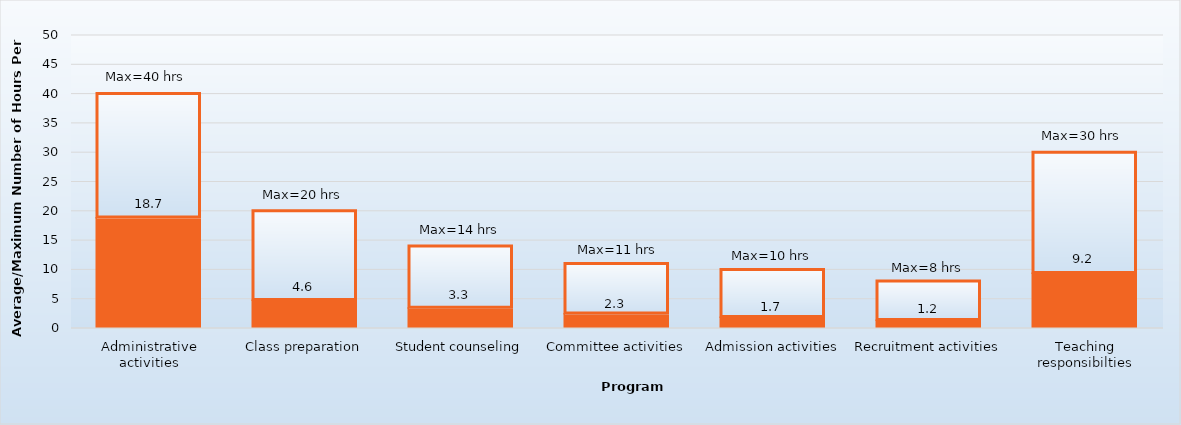
| Category | Average hours per week | Maximum |
|---|---|---|
| Administrative activities | 18.7 | 21.3 |
| Class preparation | 4.6 | 15.4 |
| Student counseling | 3.3 | 10.7 |
| Committee activities | 2.3 | 8.7 |
| Admission activities | 1.7 | 8.3 |
| Recruitment activities | 1.2 | 6.8 |
| Teaching responsibilties | 9.2 | 20.8 |